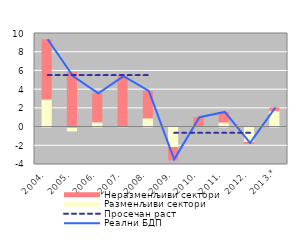
| Category | Разменљиви сектори | Неразменљиви сектори |
|---|---|---|
| 2004. | 2.981 | 6.351 |
| 2005. | -0.406 | 5.809 |
| 2006. | 0.549 | 3.007 |
| 2007. | 0.036 | 5.346 |
| 2008. | 0.977 | 2.842 |
| 2009. | -2.183 | -1.323 |
| 2010. | -0.022 | 1.029 |
| 2011. | 0.529 | 1.038 |
| 2012. | -1.634 | -0.112 |
| 2013.* | 1.757 | 0.283 |